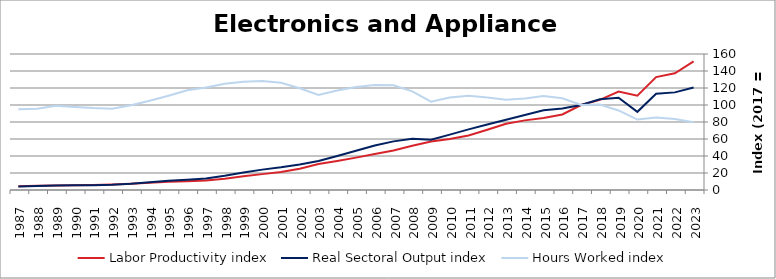
| Category | Labor Productivity index | Real Sectoral Output index | Hours Worked index |
|---|---|---|---|
| 2023.0 | 151.371 | 120.663 | 79.713 |
| 2022.0 | 137.316 | 114.846 | 83.636 |
| 2021.0 | 132.784 | 113.236 | 85.278 |
| 2020.0 | 110.919 | 91.949 | 82.898 |
| 2019.0 | 115.893 | 108.475 | 93.599 |
| 2018.0 | 106.061 | 106.675 | 100.579 |
| 2017.0 | 100 | 100 | 100 |
| 2016.0 | 88.871 | 95.848 | 107.85 |
| 2015.0 | 84.726 | 93.707 | 110.599 |
| 2014.0 | 81.911 | 88.17 | 107.642 |
| 2013.0 | 77.902 | 82.682 | 106.136 |
| 2012.0 | 70.952 | 77.12 | 108.693 |
| 2011.0 | 64.217 | 71.289 | 111.012 |
| 2010.0 | 59.905 | 65.152 | 108.758 |
| 2009.0 | 56.956 | 59.199 | 103.937 |
| 2008.0 | 51.963 | 60.3 | 116.043 |
| 2007.0 | 46.441 | 57.22 | 123.208 |
| 2006.0 | 42.281 | 52.276 | 123.638 |
| 2005.0 | 38.075 | 46.089 | 121.049 |
| 2004.0 | 34.173 | 40.015 | 117.095 |
| 2003.0 | 30.508 | 34.089 | 111.736 |
| 2002.0 | 25.065 | 29.989 | 119.643 |
| 2001.0 | 21.163 | 26.689 | 126.112 |
| 2000.0 | 18.682 | 23.969 | 128.302 |
| 1999.0 | 16.256 | 20.692 | 127.289 |
| 1998.0 | 13.349 | 16.682 | 124.966 |
| 1997.0 | 11.192 | 13.493 | 120.558 |
| 1996.0 | 10.403 | 12.2 | 117.274 |
| 1995.0 | 9.78 | 10.851 | 110.941 |
| 1994.0 | 8.585 | 9.014 | 105.001 |
| 1993.0 | 7.38 | 7.35 | 99.595 |
| 1992.0 | 6.559 | 6.279 | 95.729 |
| 1991.0 | 5.943 | 5.727 | 96.365 |
| 1990.0 | 5.587 | 5.455 | 97.635 |
| 1989.0 | 5.272 | 5.218 | 98.986 |
| 1988.0 | 5.03 | 4.813 | 95.69 |
| 1987.0 | 4.47 | 4.247 | 95.018 |